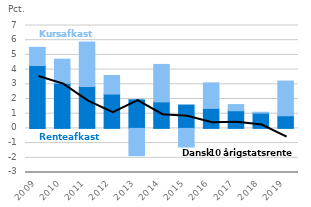
| Category | Renteafkast | Kursafkast |
|---|---|---|
| 2009.0 | 4.275 | 1.238 |
| 2010.0 | 3.073 | 1.636 |
| 2011.0 | 2.85 | 3.027 |
| 2012.0 | 2.336 | 1.263 |
| 2013.0 | 1.948 | -1.855 |
| 2014.0 | 1.803 | 2.549 |
| 2015.0 | 1.59 | -1.267 |
| 2016.0 | 1.362 | 1.735 |
| 2017.0 | 1.201 | 0.42 |
| 2018.0 | 1.04 | 0.061 |
| 2019.0 | 0.86 | 2.361 |